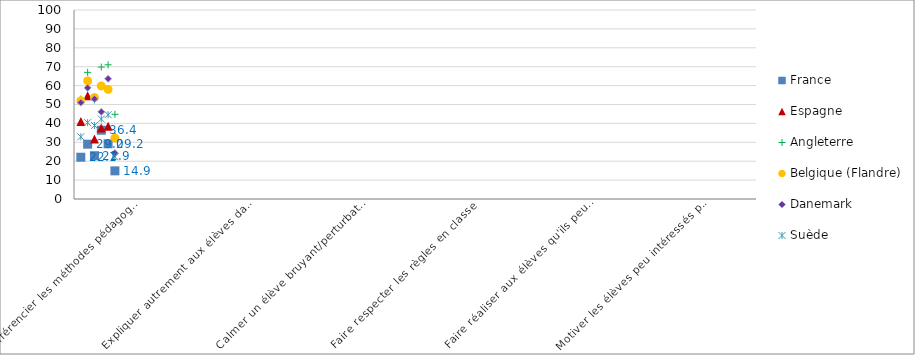
| Category | Series 0 |
|---|---|
| Différencier les méthodes pédagogiques | 0 |
| Expliquer autrement aux élèves dans la confusion | 0 |
| Calmer un élève bruyant/perturbateur | 0 |
| Faire respecter les règles en classe | 0 |
| Faire réaliser aux élèves qu'ils peuvent avoir de bons résultats | 0 |
| Motiver les élèves peu intéressés par le travail scolaire | 0 |